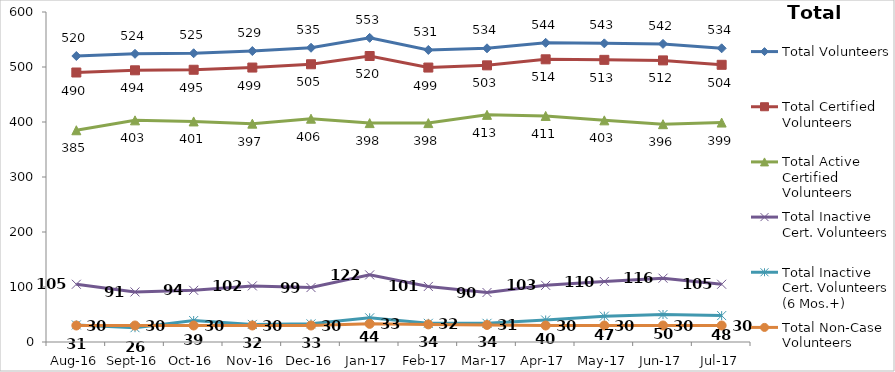
| Category | Total Volunteers | Total Certified Volunteers | Total Active Certified Volunteers | Total Inactive Cert. Volunteers | Total Inactive Cert. Volunteers (6 Mos.+) | Total Non-Case Volunteers |
|---|---|---|---|---|---|---|
| Aug-16 | 520 | 490 | 385 | 105 | 31 | 30 |
| Sep-16 | 524 | 494 | 403 | 91 | 26 | 30 |
| Oct-16 | 525 | 495 | 401 | 94 | 39 | 30 |
| Nov-16 | 529 | 499 | 397 | 102 | 32 | 30 |
| Dec-16 | 535 | 505 | 406 | 99 | 33 | 30 |
| Jan-17 | 553 | 520 | 398 | 122 | 44 | 33 |
| Feb-17 | 531 | 499 | 398 | 101 | 34 | 32 |
| Mar-17 | 534 | 503 | 413 | 90 | 34 | 31 |
| Apr-17 | 544 | 514 | 411 | 103 | 40 | 30 |
| May-17 | 543 | 513 | 403 | 110 | 47 | 30 |
| Jun-17 | 542 | 512 | 396 | 116 | 50 | 30 |
| Jul-17 | 534 | 504 | 399 | 105 | 48 | 30 |